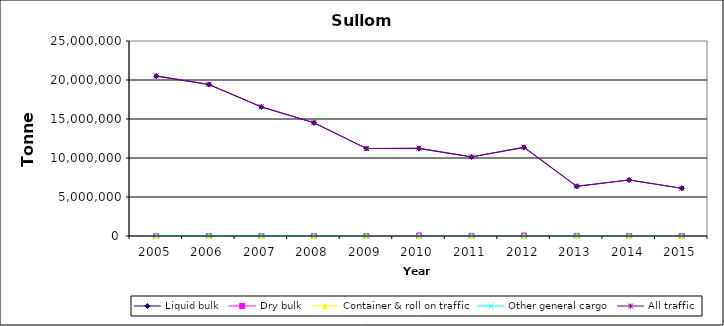
| Category | Liquid bulk | Dry bulk | Container & roll on traffic | Other general cargo | All traffic |
|---|---|---|---|---|---|
| 2005.0 | 20494000 | 0 | 0 | 47000 | 20541000 |
| 2006.0 | 19417000 | 0 | 0 | 30000 | 19447000 |
| 2007.0 | 16537000 | 0 | 0 | 36000 | 16573000 |
| 2008.0 | 14507000 | 0 | 0 | 32000 | 14539000 |
| 2009.0 | 11216595 | 0 | 0 | 0 | 11216595 |
| 2010.0 | 11202000 | 69000 | 0 | 0 | 11270000 |
| 2011.0 | 10134000 | 12000 | 0 | 7000 | 10153000 |
| 2012.0 | 11339000 | 57000 | 0 | 2000 | 11398000 |
| 2013.0 | 6357000 | 13000 | 0 | 24000 | 6394000 |
| 2014.0 | 7180000 | 0 | 0 | 5000 | 7185000 |
| 2015.0 | 6114000 | 5000 | 0 | 0 | 6120000 |